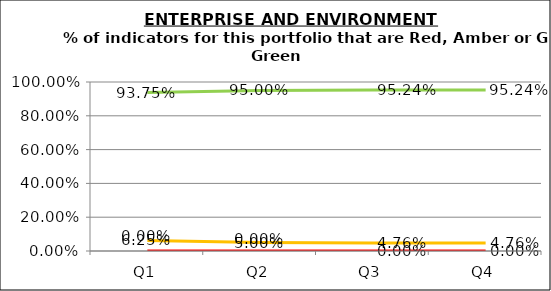
| Category | Green | Amber | Red |
|---|---|---|---|
| Q1 | 0.938 | 0.062 | 0 |
| Q2 | 0.95 | 0.05 | 0 |
| Q3 | 0.952 | 0.048 | 0 |
| Q4 | 0.952 | 0.048 | 0 |